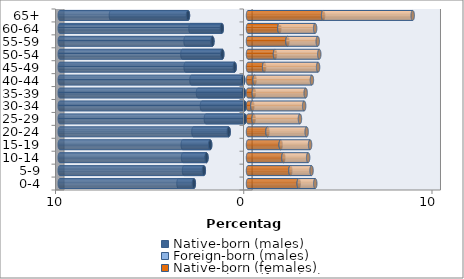
| Category | Native-born (males) | Foreign-born (males) | Native-born (females) | Foreign-born (females) |
|---|---|---|---|---|
| 0-4 | -2.876 | -0.816 | 2.694 | 0.879 |
| 5-9 | -2.346 | -1.054 | 2.252 | 1.124 |
| 10-14 | -2.206 | -1.245 | 1.878 | 1.317 |
| 15-19 | -2.01 | -1.455 | 1.736 | 1.562 |
| 20-24 | -1.026 | -1.875 | 1.034 | 2.08 |
| 25-29 | -0.17 | -2.069 | 0.299 | 2.46 |
| 30-34 | -0.176 | -2.271 | 0.231 | 2.752 |
| 35-39 | -0.225 | -2.433 | 0.31 | 2.753 |
| 40-44 | -0.256 | -2.748 | 0.349 | 3.046 |
| 45-49 | -0.709 | -2.604 | 0.856 | 2.867 |
| 50-54 | -1.366 | -2.12 | 1.434 | 2.353 |
| 55-59 | -1.889 | -1.429 | 2.095 | 1.609 |
| 60-64 | -1.393 | -1.665 | 1.666 | 1.901 |
| 65+ | -3.189 | -4.095 | 3.991 | 4.76 |